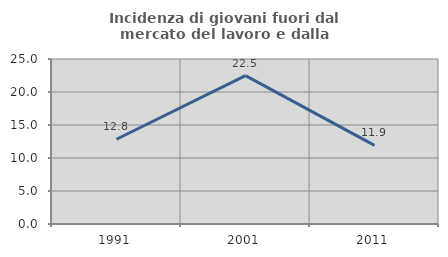
| Category | Incidenza di giovani fuori dal mercato del lavoro e dalla formazione  |
|---|---|
| 1991.0 | 12.842 |
| 2001.0 | 22.481 |
| 2011.0 | 11.921 |